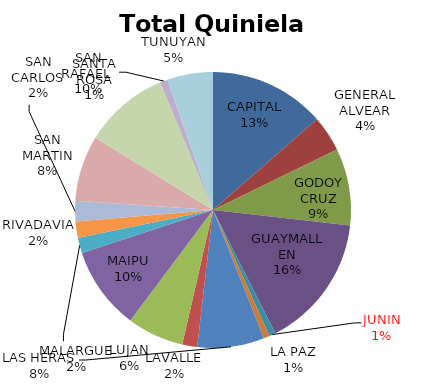
| Category | Total Quiniela Beneficio |
|---|---|
| CAPITAL | 2988731.53 |
| GENERAL ALVEAR | 922840.67 |
| GODOY CRUZ | 1985275.96 |
| GUAYMALLEN | 3469383.1 |
| JUNIN | -165009.15 |
| LA PAZ | 153992.26 |
| LAS HERAS | 1723707.89 |
| LAVALLE | 386775.45 |
| LUJAN | 1463415.81 |
| MAIPU | 2143472.81 |
| MALARGUE | 394520.74 |
| RIVADAVIA | 421255.47 |
| SAN CARLOS | 527127.3 |
| SAN MARTIN | 1692603.29 |
| SAN RAFAEL  | 2199567.8 |
| SANTA ROSA | 199377.73 |
| TUNUYAN | 1177498.3 |